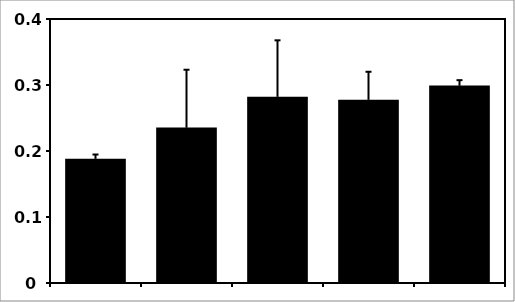
| Category | Series 0 |
|---|---|
| 0 | 0.188 |
| 1 | 0.236 |
| 2 | 0.282 |
| 3 | 0.278 |
| 4 | 0.299 |